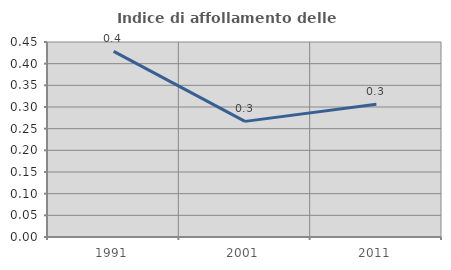
| Category | Indice di affollamento delle abitazioni  |
|---|---|
| 1991.0 | 0.428 |
| 2001.0 | 0.267 |
| 2011.0 | 0.306 |